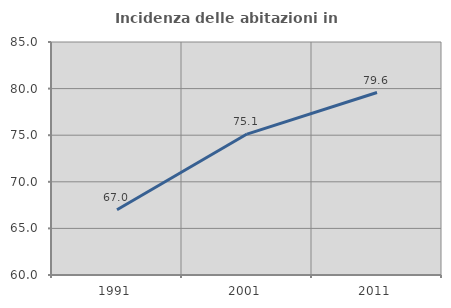
| Category | Incidenza delle abitazioni in proprietà  |
|---|---|
| 1991.0 | 67 |
| 2001.0 | 75.121 |
| 2011.0 | 79.581 |